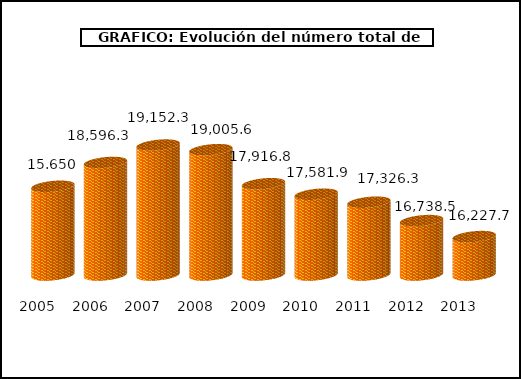
| Category | Series 0 |
|---|---|
| 2005.0 | 17835.4 |
| 2006.0 | 18596.3 |
| 2007.0 | 19152.3 |
| 2008.0 | 19005.6 |
| 2009.0 | 17916.8 |
| 2010.0 | 17581.9 |
| 2011.0 | 17326.3 |
| 2012.0 | 16738.5 |
| 2013.0 | 16227.7 |